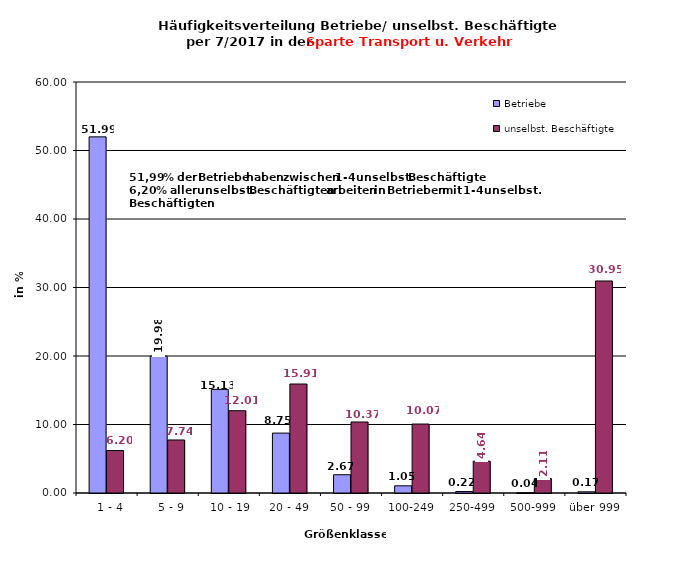
| Category | Betriebe | unselbst. Beschäftigte |
|---|---|---|
|   1 - 4 | 51.99 | 6.198 |
|   5 - 9 | 19.983 | 7.74 |
|  10 - 19 | 15.129 | 12.013 |
| 20 - 49 | 8.745 | 15.912 |
| 50 - 99 | 2.667 | 10.366 |
| 100-249 | 1.049 | 10.068 |
| 250-499 | 0.219 | 4.643 |
| 500-999 | 0.044 | 2.11 |
| über 999 | 0.175 | 30.951 |